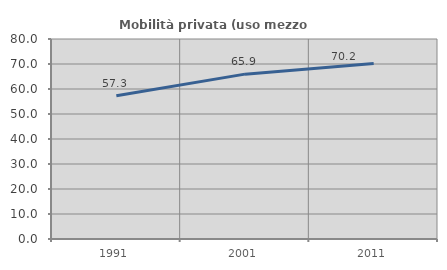
| Category | Mobilità privata (uso mezzo privato) |
|---|---|
| 1991.0 | 57.27 |
| 2001.0 | 65.943 |
| 2011.0 | 70.232 |